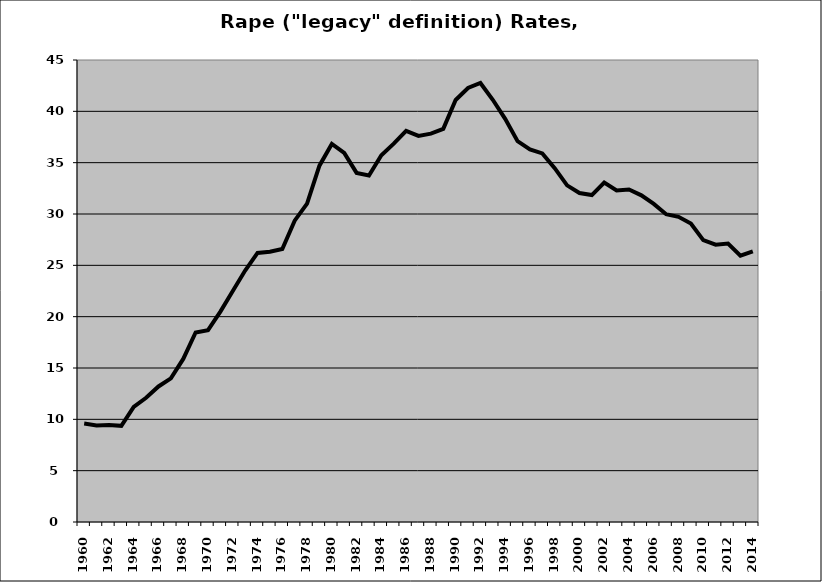
| Category | Rape |
|---|---|
| 1960.0 | 9.586 |
| 1961.0 | 9.41 |
| 1962.0 | 9.447 |
| 1963.0 | 9.364 |
| 1964.0 | 11.206 |
| 1965.0 | 12.097 |
| 1966.0 | 13.202 |
| 1967.0 | 13.988 |
| 1968.0 | 15.883 |
| 1969.0 | 18.457 |
| 1970.0 | 18.693 |
| 1971.0 | 20.493 |
| 1972.0 | 22.499 |
| 1973.0 | 24.494 |
| 1974.0 | 26.207 |
| 1975.0 | 26.318 |
| 1976.0 | 26.591 |
| 1977.0 | 29.353 |
| 1978.0 | 31.005 |
| 1979.0 | 34.707 |
| 1980.0 | 36.827 |
| 1981.0 | 35.953 |
| 1982.0 | 34.002 |
| 1983.0 | 33.756 |
| 1984.0 | 35.718 |
| 1985.0 | 36.848 |
| 1986.0 | 38.087 |
| 1987.0 | 37.604 |
| 1988.0 | 37.827 |
| 1989.0 | 38.289 |
| 1990.0 | 41.11 |
| 1991.0 | 42.273 |
| 1992.0 | 42.764 |
| 1993.0 | 41.125 |
| 1994.0 | 39.264 |
| 1995.0 | 37.089 |
| 1996.0 | 36.29 |
| 1997.0 | 35.907 |
| 1998.0 | 34.466 |
| 1999.0 | 32.788 |
| 2000.0 | 32.044 |
| 2001.0 | 31.846 |
| 2002.0 | 33.071 |
| 2003.0 | 32.286 |
| 2004.0 | 32.381 |
| 2005.0 | 31.819 |
| 2006.0 | 30.981 |
| 2007.0 | 29.98 |
| 2008.0 | 29.726 |
| 2009.0 | 29.068 |
| 2010.0 | 27.455 |
| 2011.0 | 27.015 |
| 2012.0 | 27.126 |
| 2013.0 | 25.943 |
| 2014.0 | 26.357 |